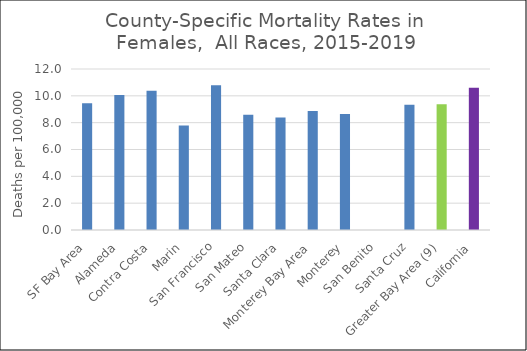
| Category | Female |
|---|---|
| SF Bay Area | 9.44 |
|   Alameda | 10.07 |
|   Contra Costa | 10.38 |
|   Marin | 7.79 |
|   San Francisco | 10.79 |
|   San Mateo | 8.59 |
|   Santa Clara | 8.38 |
| Monterey Bay Area | 8.87 |
|   Monterey | 8.64 |
|   San Benito | 0 |
|   Santa Cruz | 9.33 |
| Greater Bay Area (9) | 9.38 |
| California | 10.61 |